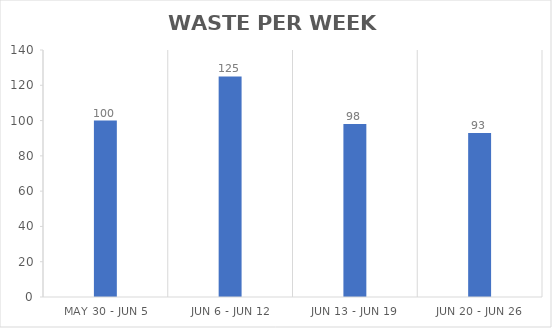
| Category | Weekly Weight
(lbs) |
|---|---|
| May 30 - Jun 5 | 100 |
| Jun 6 - Jun 12 | 125 |
| Jun 13 - Jun 19 | 98 |
| Jun 20 - Jun 26 | 93 |